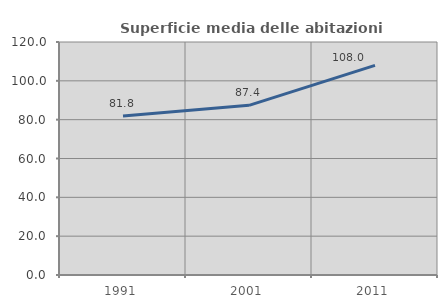
| Category | Superficie media delle abitazioni occupate |
|---|---|
| 1991.0 | 81.839 |
| 2001.0 | 87.382 |
| 2011.0 | 107.963 |